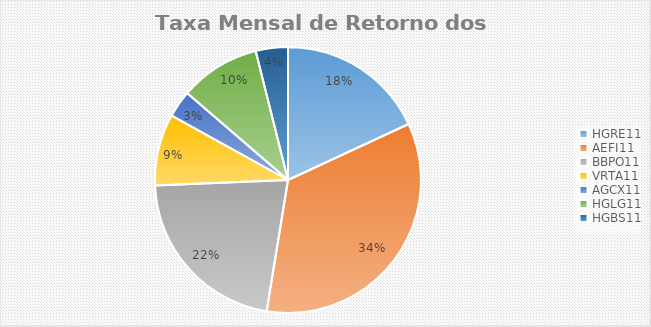
| Category | Series 0 |
|---|---|
| HGRE11 | 0.029 |
| AEFI11 | 0.055 |
| BBPO11 | 0.035 |
| VRTA11 | -0.014 |
| AGCX11 | 0.005 |
| HGLG11 | 0.016 |
| HGBS11 | 0.006 |